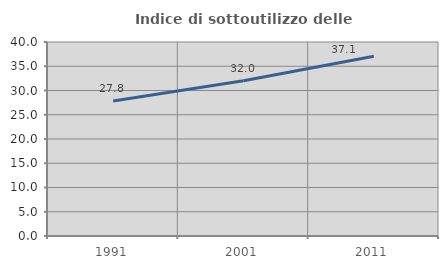
| Category | Indice di sottoutilizzo delle abitazioni  |
|---|---|
| 1991.0 | 27.846 |
| 2001.0 | 32.023 |
| 2011.0 | 37.068 |